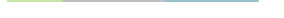
| Category | Series 0 | Series 1 | Series 2 |
|---|---|---|---|
| 0 | 18110 | 33358 | 30951 |